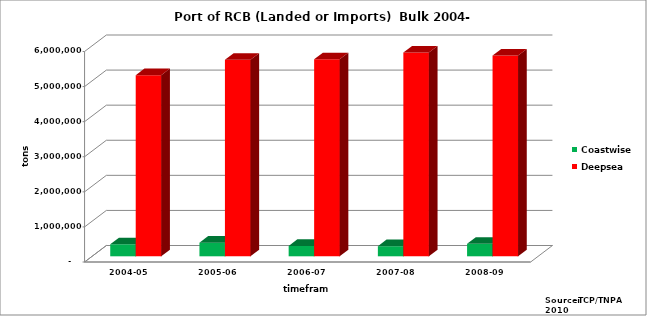
| Category | Coastwise | Deepsea |
|---|---|---|
| 2004-05 | 343047 | 5163727 |
| 2005-06 | 387464 | 5601448 |
| 2006-07 | 294930 | 5612996 |
| 2007-08 | 287254 | 5806273 |
| 2008-09 | 355927 | 5720175 |